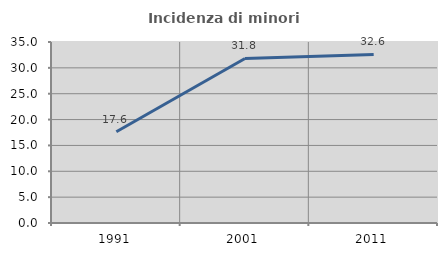
| Category | Incidenza di minori stranieri |
|---|---|
| 1991.0 | 17.647 |
| 2001.0 | 31.818 |
| 2011.0 | 32.6 |